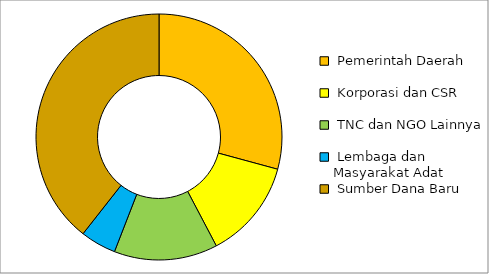
| Category | Series 0 |
|---|---|
|  Pemerintah Daerah  | 5423251950 |
|  Korporasi dan CSR  | 2424692700 |
|  TNC dan NGO Lainnya  | 2525589600 |
|  Lembaga dan Masyarakat Adat  | 872334400 |
|  Sumber Dana Baru  | 7311682750 |